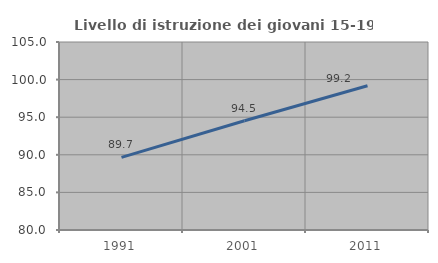
| Category | Livello di istruzione dei giovani 15-19 anni |
|---|---|
| 1991.0 | 89.655 |
| 2001.0 | 94.531 |
| 2011.0 | 99.187 |